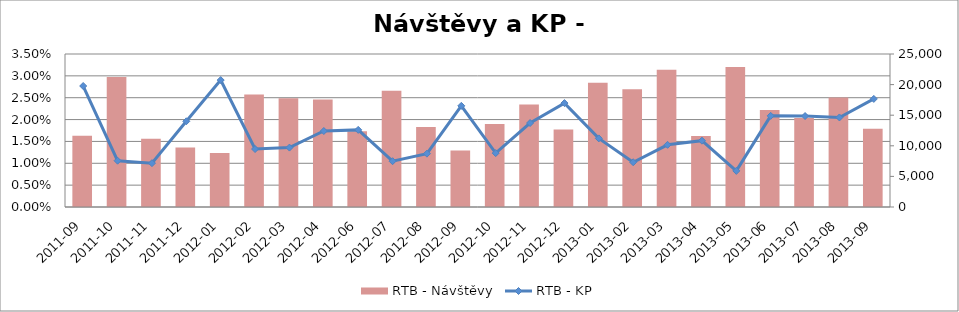
| Category | RTB - Návštěvy |
|---|---|
| 2011-09 | 11660.346 |
| 2011-10 | 21241.74 |
| 2011-11 | 11151.279 |
| 2011-12 | 9714.827 |
| 2012-01 | 8817.337 |
| 2012-02 | 18385.759 |
| 2012-03 | 17779.443 |
| 2012-04 | 17550.933 |
| 2012-06 | 12367.078 |
| 2012-07 | 18982.37 |
| 2012-08 | 13084.494 |
| 2012-09 | 9220.629 |
| 2012-10 | 13580.956 |
| 2012-11 | 16740.36 |
| 2012-12 | 12656.799 |
| 2013-01 | 20303.037 |
| 2013-02 | 19229.892 |
| 2013-03 | 22417.667 |
| 2013-04 | 11605.76 |
| 2013-05 | 22862.335 |
| 2013-06 | 15854.025 |
| 2013-07 | 14546.294 |
| 2013-08 | 17891.345 |
| 2013-09 | 12804.919 |